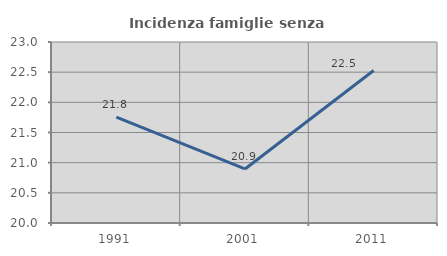
| Category | Incidenza famiglie senza nuclei |
|---|---|
| 1991.0 | 21.756 |
| 2001.0 | 20.896 |
| 2011.0 | 22.528 |